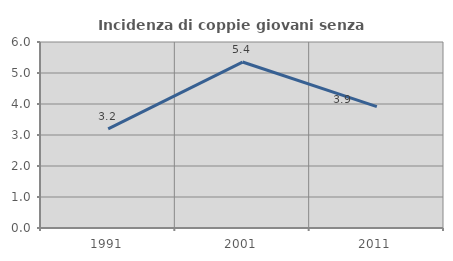
| Category | Incidenza di coppie giovani senza figli |
|---|---|
| 1991.0 | 3.2 |
| 2001.0 | 5.354 |
| 2011.0 | 3.915 |